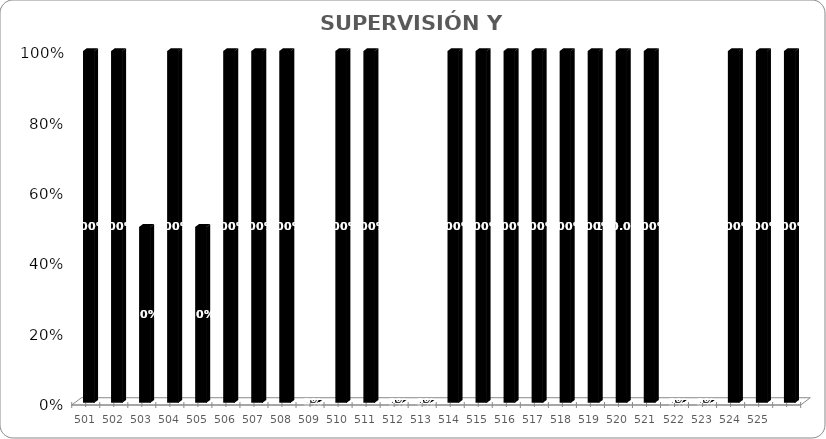
| Category | % Avance |
|---|---|
| 501.0 | 1 |
| 502.0 | 1 |
| 503.0 | 0.5 |
| 504.0 | 1 |
| 505.0 | 0.5 |
| 506.0 | 1 |
| 507.0 | 1 |
| 508.0 | 1 |
| 509.0 | 0 |
| 510.0 | 1 |
| 511.0 | 1 |
| 512.0 | 0 |
| 513.0 | 0 |
| 514.0 | 1 |
| 515.0 | 1 |
| 516.0 | 1 |
| 517.0 | 1 |
| 518.0 | 1 |
| 519.0 | 1 |
| 520.0 | 1 |
| 521.0 | 1 |
| 522.0 | 0 |
| 523.0 | 0 |
| 524.0 | 1 |
| 525.0 | 1 |